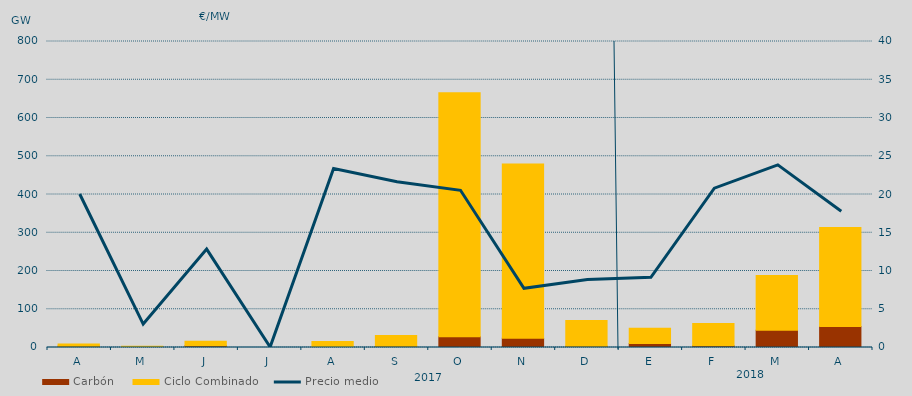
| Category | Carbón | Ciclo Combinado |
|---|---|---|
| A | 3055 | 6101.5 |
| M | 341 | 2659 |
| J | 4305 | 11713 |
| J | 0 | 0 |
| A | 0 | 15430.5 |
| S | 3306.6 | 27967.5 |
| O | 27914.4 | 638167.2 |
| N | 23926.9 | 455734.5 |
| D | 3200.6 | 67420.5 |
| E | 10696.2 | 39454.7 |
| F | 4341.9 | 58215.4 |
| M | 45246.3 | 142680.5 |
| A | 55123 | 258682.2 |